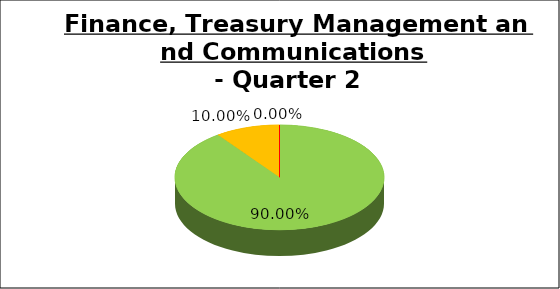
| Category | Q2 |
|---|---|
| Green | 0.9 |
| Amber | 0.1 |
| Red | 0 |